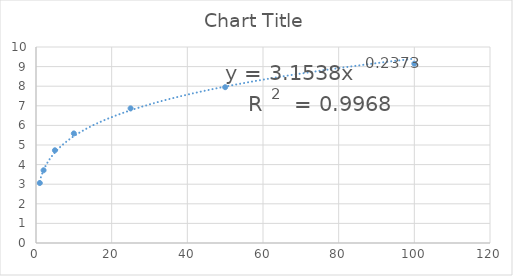
| Category | Series 0 |
|---|---|
| 1.0 | 3.06 |
| 2.0 | 3.71 |
| 5.0 | 4.73 |
| 10.0 | 5.59 |
| 25.0 | 6.87 |
| 50.0 | 7.95 |
| 100.0 | 9.15 |